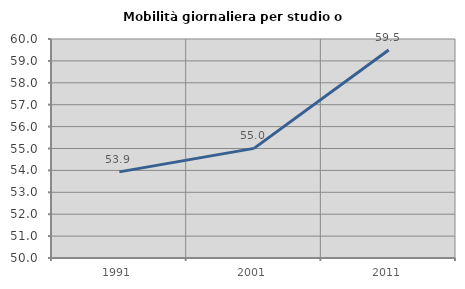
| Category | Mobilità giornaliera per studio o lavoro |
|---|---|
| 1991.0 | 53.932 |
| 2001.0 | 55.005 |
| 2011.0 | 59.501 |